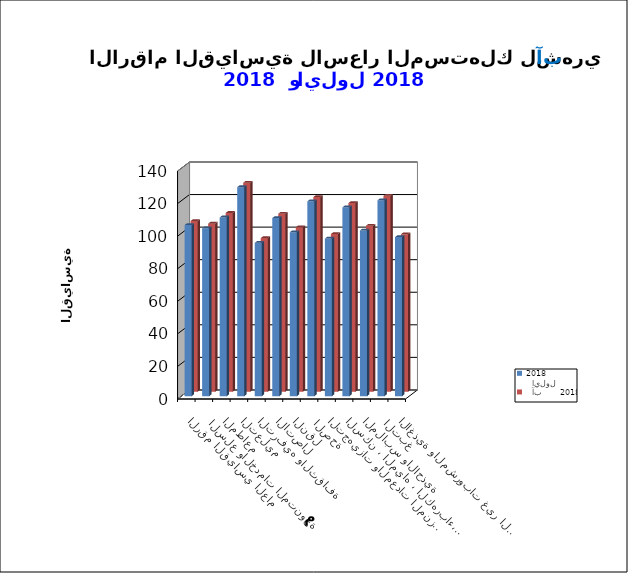
| Category |   ايلول      2018      |   آب      2018      |
|---|---|---|
| الاغذية والمشروبات غير الكحولية | 97.7 | 96.7 |
|  التبغ | 120.3 | 120.3 |
| الملابس والاحذية | 101.8 | 101.9 |
| السكن ، المياه ، الكهرباء، الغاز  | 116 | 115.8 |
| التجهيزات والمعدات المنزلية والصيانة | 96.8 | 96.8 |
|  الصحة | 119.7 | 119.5 |
| النقل | 100.7 | 101 |
| الاتصال | 109.4 | 109.3 |
| الترفيه والثقافة | 94.2 | 94.3 |
| التعليم | 128.4 | 128.3 |
| المطاعم  | 109.8 | 109.8 |
|  السلع والخدمات المتنوعة | 103.1 | 103.2 |
| الرقم القياسي العام | 105.1 | 104.8 |